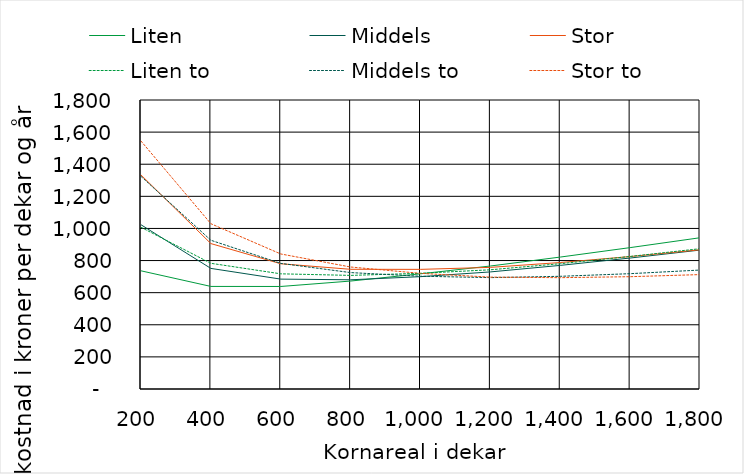
| Category | Liten | Middels | Stor | Liten to | Middels to | Stor to |
|---|---|---|---|---|---|---|
| 200.0 | 736.094 | 1022.914 | 1333.073 | 1007.182 | 1324.298 | 1544.269 |
| 400.0 | 638.859 | 751.08 | 905.704 | 782.925 | 926.366 | 1029.442 |
| 600.0 | 638.6 | 684.357 | 780.08 | 717.355 | 782.407 | 841.04 |
| 800.0 | 672.364 | 680.25 | 745.476 | 707.55 | 725.009 | 759.799 |
| 1000.0 | 717.517 | 699.691 | 745.082 | 720.534 | 702.399 | 720.301 |
| 1200.0 | 766.085 | 729.242 | 757.557 | 742.536 | 693.731 | 696.798 |
| 1400.0 | 821.7 | 769.909 | 787.696 | 780.353 | 701.871 | 693.364 |
| 1600.0 | 880.554 | 815.675 | 824.965 | 825.6 | 718.312 | 699.475 |
| 1800.0 | 942.057 | 865.349 | 867.246 | 873.841 | 740.888 | 712.56 |